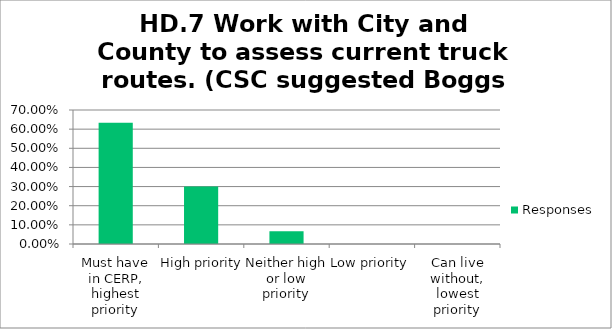
| Category | Responses |
|---|---|
| Must have in CERP, highest priority | 0.633 |
| High priority | 0.3 |
| Neither high or low priority | 0.067 |
| Low priority | 0 |
| Can live without, lowest priority | 0 |